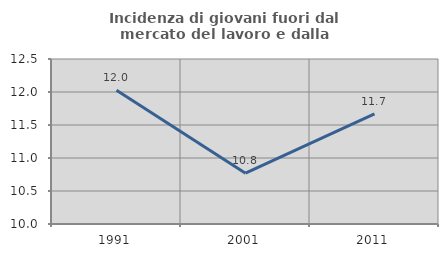
| Category | Incidenza di giovani fuori dal mercato del lavoro e dalla formazione  |
|---|---|
| 1991.0 | 12.026 |
| 2001.0 | 10.769 |
| 2011.0 | 11.67 |